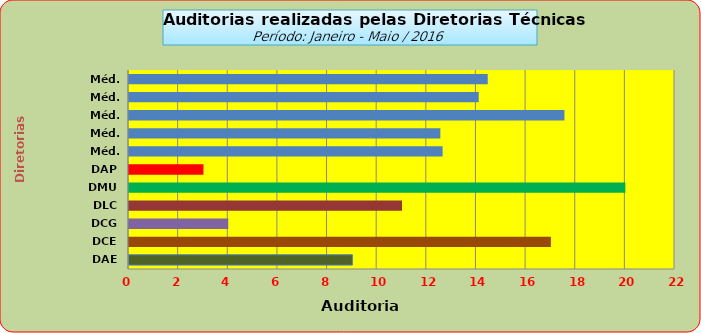
| Category | Series 0 |
|---|---|
| DAE | 9 |
| DCE | 17 |
| DCG | 4 |
| DLC | 11 |
| DMU | 20 |
| DAP | 3 |
| Méd. 2011 | 12.636 |
| Méd. 2012 | 12.545 |
| Méd. 2013 | 17.545 |
| Méd. 2014 | 14.091 |
| Méd. 2014 | 14.455 |